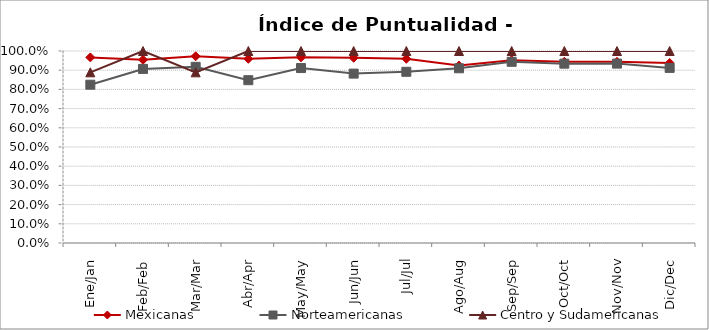
| Category | Mexicanas | Norteamericanas | Centro y Sudamericanas |
|---|---|---|---|
| Ene/Jan | 0.967 | 0.824 | 0.889 |
| Feb/Feb | 0.954 | 0.907 | 1 |
| Mar/Mar | 0.972 | 0.918 | 0.889 |
| Abr/Apr | 0.959 | 0.848 | 1 |
| May/May | 0.967 | 0.911 | 1 |
| Jun/Jun | 0.964 | 0.882 | 1 |
| Jul/Jul | 0.959 | 0.892 | 1 |
| Ago/Aug | 0.924 | 0.91 | 1 |
| Sep/Sep | 0.952 | 0.944 | 1 |
| Oct/Oct | 0.944 | 0.934 | 1 |
| Nov/Nov | 0.944 | 0.934 | 1 |
| Dic/Dec | 0.938 | 0.912 | 1 |